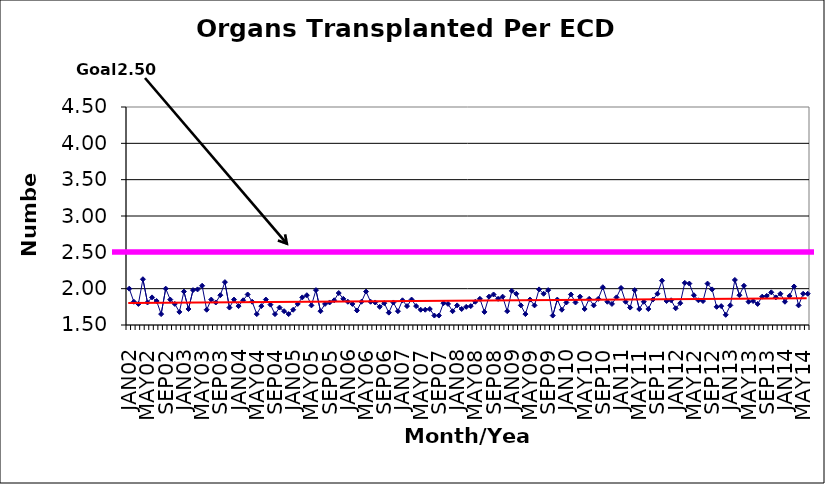
| Category | Series 0 |
|---|---|
| JAN02 | 2 |
| FEB02 | 1.82 |
| MAR02 | 1.79 |
| APR02 | 2.13 |
| MAY02 | 1.81 |
| JUN02 | 1.88 |
| JUL02 | 1.83 |
| AUG02 | 1.65 |
| SEP02 | 2 |
| OCT02 | 1.85 |
| NOV02 | 1.79 |
| DEC02 | 1.68 |
| JAN03 | 1.96 |
| FEB03 | 1.72 |
| MAR03 | 1.98 |
| APR03 | 1.99 |
| MAY03 | 2.04 |
| JUN03 | 1.71 |
| JUL03 | 1.85 |
| AUG03 | 1.81 |
| SEP03 | 1.91 |
| OCT03 | 2.09 |
| NOV03 | 1.74 |
| DEC03 | 1.85 |
| JAN04 | 1.76 |
| FEB04 | 1.84 |
| MAR04 | 1.92 |
| APR04 | 1.82 |
| MAY04 | 1.65 |
| JUN04 | 1.76 |
| JUL04 | 1.85 |
| AUG04 | 1.78 |
| SEP04 | 1.65 |
| OCT04 | 1.74 |
| NOV04 | 1.69 |
| DEC04 | 1.65 |
| JAN05 | 1.71 |
| FEB05 | 1.79 |
| MAR05 | 1.88 |
| APR05 | 1.91 |
| MAY05 | 1.77 |
| JUN05 | 1.98 |
| JUL05 | 1.69 |
| AUG05 | 1.79 |
| SEP05 | 1.81 |
| OCT05 | 1.84 |
| NOV05 | 1.94 |
| DEC05 | 1.86 |
| JAN06 | 1.82 |
| FEB06 | 1.79 |
| MAR06 | 1.7 |
| APR06 | 1.82 |
| MAY06 | 1.96 |
| JUN06 | 1.82 |
| JUL06 | 1.81 |
| AUG06 | 1.75 |
| SEP06 | 1.8 |
| OCT06 | 1.67 |
| NOV06 | 1.81 |
| DEC06 | 1.69 |
| JAN07 | 1.84 |
| FEB07 | 1.76 |
| MAR07 | 1.85 |
| APR07 | 1.76 |
| MAY07 | 1.71 |
| JUN07 | 1.71 |
| JUL07 | 1.72 |
| AUG07 | 1.63 |
| SEP07 | 1.63 |
| OCT07 | 1.8 |
| NOV07 | 1.79 |
| DEC07 | 1.69 |
| JAN08 | 1.77 |
| FEB08 | 1.72 |
| MAR08 | 1.75 |
| APR08 | 1.76 |
| MAY08 | 1.82 |
| JUN08 | 1.86 |
| JUL08 | 1.68 |
| AUG08 | 1.89 |
| SEP08 | 1.92 |
| OCT08 | 1.86 |
| NOV08 | 1.89 |
| DEC08 | 1.69 |
| JAN09 | 1.97 |
| FEB09 | 1.93 |
| MAR09 | 1.77 |
| APR09 | 1.65 |
| MAY09 | 1.85 |
| JUN09 | 1.77 |
| JUL09 | 1.99 |
| AUG09 | 1.93 |
| SEP09 | 1.98 |
| OCT09 | 1.63 |
| NOV09 | 1.85 |
| DEC09 | 1.71 |
| JAN10 | 1.81 |
| FEB10 | 1.92 |
| MAR10 | 1.81 |
| APR10 | 1.89 |
| MAY10 | 1.72 |
| JUN10 | 1.86 |
| JUL10 | 1.77 |
| AUG10 | 1.86 |
| SEP10 | 2.02 |
| OCT10 | 1.82 |
| NOV10 | 1.79 |
| DEC10 | 1.88 |
| JAN11 | 2.01 |
| FEB11 | 1.82 |
| MAR11 | 1.74 |
| APR11 | 1.98 |
| MAY11 | 1.72 |
| JUN11 | 1.82 |
| JUL11 | 1.72 |
| AUG11 | 1.85 |
| SEP11 | 1.93 |
| OCT11 | 2.11 |
| NOV11 | 1.83 |
| DEC11 | 1.84 |
| JAN12 | 1.73 |
| FEB12 | 1.8 |
| MAR12 | 2.08 |
| APR12 | 2.07 |
| MAY12 | 1.91 |
| JUN12 | 1.84 |
| JUL12 | 1.83 |
| AUG12 | 2.07 |
| SEP12 | 1.99 |
| OCT12 | 1.75 |
| NOV12 | 1.76 |
| DEC12 | 1.64 |
| JAN13 | 1.77 |
| FEB13 | 2.12 |
| MAR13 | 1.91 |
| APR13 | 2.04 |
| MAY13 | 1.82 |
| JUN13 | 1.83 |
| JUL13 | 1.79 |
| AUG13 | 1.89 |
| SEP13 | 1.9 |
| OCT13 | 1.95 |
| NOV13 | 1.88 |
| DEC13 | 1.93 |
| JAN14 | 1.82 |
| FEB14 | 1.9 |
| MAR14 | 2.03 |
| APR14 | 1.77 |
| MAY14 | 1.93 |
| JUN14 | 1.93 |